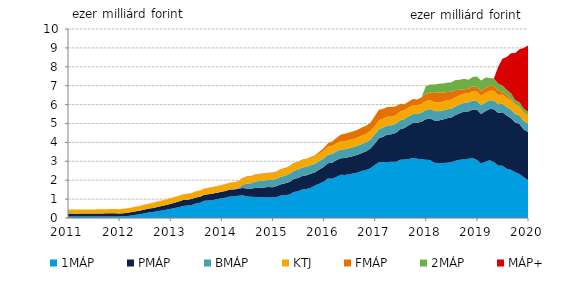
| Category | 1MÁP | PMÁP | BMÁP | KTJ | FMÁP | 2MÁP | MÁP+ |
|---|---|---|---|---|---|---|---|
| 1/31/11 | 0.085 | 0.141 | 0 | 0.218 | 0 | 0 | 0 |
| 2/28/11 | 0.085 | 0.147 | 0 | 0.218 | 0 | 0 | 0 |
| 3/31/11 | 0.081 | 0.149 | 0 | 0.217 | 0 | 0 | 0 |
| 4/30/11 | 0.082 | 0.156 | 0 | 0.216 | 0 | 0 | 0 |
| 5/31/11 | 0.083 | 0.158 | 0 | 0.215 | 0 | 0 | 0 |
| 6/30/11 | 0.083 | 0.159 | 0 | 0.214 | 0 | 0 | 0 |
| 7/31/11 | 0.082 | 0.16 | 0 | 0.214 | 0 | 0 | 0 |
| 8/31/11 | 0.081 | 0.161 | 0 | 0.215 | 0 | 0 | 0 |
| 9/30/11 | 0.08 | 0.164 | 0 | 0.217 | 0 | 0 | 0 |
| 10/31/11 | 0.079 | 0.166 | 0 | 0.219 | 0 | 0 | 0 |
| 11/30/11 | 0.08 | 0.166 | 0 | 0.223 | 0 | 0 | 0 |
| 12/31/11 | 0.08 | 0.166 | 0 | 0.226 | 0 | 0 | 0 |
| 1/31/12 | 0.081 | 0.155 | 0 | 0.225 | 0 | 0 | 0 |
| 2/29/12 | 0.089 | 0.168 | 0 | 0.23 | 0 | 0 | 0 |
| 3/31/12 | 0.106 | 0.176 | 0 | 0.236 | 0 | 0 | 0 |
| 4/30/12 | 0.131 | 0.182 | 0 | 0.24 | 0 | 0 | 0 |
| 5/31/12 | 0.17 | 0.186 | 0 | 0.245 | 0.003 | 0 | 0 |
| 6/30/12 | 0.198 | 0.194 | 0 | 0.25 | 0.004 | 0 | 0 |
| 7/31/12 | 0.254 | 0.2 | 0 | 0.257 | 0.006 | 0 | 0 |
| 8/31/12 | 0.294 | 0.206 | 0 | 0.263 | 0.008 | 0 | 0 |
| 9/30/12 | 0.32 | 0.211 | 0 | 0.268 | 0.008 | 0 | 0 |
| 10/31/12 | 0.358 | 0.227 | 0 | 0.273 | 0.01 | 0 | 0 |
| 11/30/12 | 0.395 | 0.242 | 0 | 0.279 | 0.009 | 0 | 0 |
| 12/31/12 | 0.434 | 0.256 | 0 | 0.284 | 0.01 | 0 | 0 |
| 1/31/13 | 0.482 | 0.26 | 0 | 0.289 | 0.011 | 0 | 0 |
| 2/28/13 | 0.528 | 0.279 | 0 | 0.291 | 0.012 | 0 | 0 |
| 3/31/13 | 0.57 | 0.3 | 0 | 0.294 | 0.013 | 0 | 0 |
| 4/30/13 | 0.636 | 0.31 | 0 | 0.297 | 0.014 | 0 | 0 |
| 5/31/13 | 0.655 | 0.314 | 0 | 0.3 | 0.014 | 0 | 0 |
| 6/30/13 | 0.687 | 0.317 | 0 | 0.302 | 0.014 | 0 | 0 |
| 7/31/13 | 0.766 | 0.324 | 0 | 0.306 | 0.015 | 0 | 0 |
| 8/31/13 | 0.813 | 0.317 | 0 | 0.313 | 0.016 | 0 | 0 |
| 9/30/13 | 0.907 | 0.324 | 0 | 0.317 | 0.019 | 0 | 0 |
| 10/31/13 | 0.927 | 0.33 | 0 | 0.321 | 0.019 | 0 | 0 |
| 11/30/13 | 0.955 | 0.336 | 0 | 0.328 | 0.021 | 0 | 0 |
| 12/31/13 | 0.988 | 0.343 | 0 | 0.335 | 0.021 | 0 | 0 |
| 1/31/14 | 1.039 | 0.354 | 0 | 0.337 | 0.022 | 0 | 0 |
| 2/28/14 | 1.073 | 0.359 | 0 | 0.34 | 0.023 | 0 | 0 |
| 3/31/14 | 1.143 | 0.363 | 0.008 | 0.345 | 0.025 | 0 | 0 |
| 4/30/14 | 1.14 | 0.364 | 0.02 | 0.346 | 0.026 | 0 | 0 |
| 5/31/14 | 1.182 | 0.367 | 0.041 | 0.347 | 0.027 | 0 | 0 |
| 6/30/14 | 1.206 | 0.379 | 0.165 | 0.347 | 0.028 | 0 | 0 |
| 7/31/14 | 1.142 | 0.419 | 0.27 | 0.347 | 0.027 | 0 | 0 |
| 8/31/14 | 1.119 | 0.446 | 0.275 | 0.348 | 0.027 | 0 | 0 |
| 9/30/14 | 1.116 | 0.475 | 0.347 | 0.349 | 0.029 | 0 | 0 |
| 10/31/14 | 1.101 | 0.499 | 0.365 | 0.352 | 0.029 | 0 | 0 |
| 11/30/14 | 1.096 | 0.524 | 0.368 | 0.353 | 0.029 | 0 | 0 |
| 12/31/14 | 1.089 | 0.556 | 0.372 | 0.355 | 0.029 | 0 | 0 |
| 1/31/15 | 1.084 | 0.545 | 0.387 | 0.358 | 0.033 | 0 | 0 |
| 2/28/15 | 1.105 | 0.589 | 0.391 | 0.359 | 0.034 | 0 | 0 |
| 3/31/15 | 1.189 | 0.603 | 0.394 | 0.368 | 0.035 | 0 | 0 |
| 4/30/15 | 1.204 | 0.635 | 0.397 | 0.37 | 0.034 | 0 | 0 |
| 5/31/15 | 1.246 | 0.665 | 0.435 | 0.372 | 0.034 | 0 | 0 |
| 6/30/15 | 1.371 | 0.686 | 0.444 | 0.376 | 0.035 | 0 | 0 |
| 7/31/15 | 1.41 | 0.706 | 0.446 | 0.382 | 0.033 | 0 | 0 |
| 8/31/15 | 1.503 | 0.718 | 0.447 | 0.387 | 0.036 | 0 | 0 |
| 9/30/15 | 1.537 | 0.728 | 0.448 | 0.389 | 0.035 | 0 | 0 |
| 10/31/15 | 1.601 | 0.739 | 0.449 | 0.394 | 0.037 | 0 | 0 |
| 11/30/15 | 1.719 | 0.701 | 0.451 | 0.398 | 0.052 | 0 | 0 |
| 12/31/15 | 1.816 | 0.744 | 0.454 | 0.403 | 0.081 | 0 | 0 |
| 1/31/16 | 1.914 | 0.782 | 0.455 | 0.409 | 0.127 | 0 | 0 |
| 2/29/16 | 2.088 | 0.809 | 0.456 | 0.415 | 0.18 | 0 | 0 |
| 3/31/16 | 2.076 | 0.852 | 0.46 | 0.415 | 0.243 | 0 | 0 |
| 4/30/16 | 2.17 | 0.885 | 0.461 | 0.419 | 0.293 | 0 | 0 |
| 5/31/16 | 2.287 | 0.874 | 0.465 | 0.423 | 0.353 | 0 | 0 |
| 6/30/16 | 2.281 | 0.892 | 0.467 | 0.426 | 0.388 | 0 | 0 |
| 7/31/16 | 2.315 | 0.907 | 0.47 | 0.43 | 0.395 | 0 | 0 |
| 8/31/16 | 2.355 | 0.924 | 0.472 | 0.433 | 0.407 | 0 | 0 |
| 9/30/16 | 2.407 | 0.941 | 0.475 | 0.437 | 0.406 | 0 | 0 |
| 10/31/16 | 2.484 | 0.959 | 0.476 | 0.439 | 0.424 | 0 | 0 |
| 11/30/16 | 2.541 | 0.985 | 0.477 | 0.444 | 0.429 | 0 | 0 |
| 12/31/16 | 2.637 | 1.043 | 0.478 | 0.454 | 0.429 | 0 | 0 |
| 1/31/17 | 2.806 | 1.125 | 0.479 | 0.46 | 0.516 | 0 | 0 |
| 2/28/17 | 2.947 | 1.268 | 0.48 | 0.46 | 0.568 | 0 | 0 |
| 3/31/17 | 2.967 | 1.337 | 0.481 | 0.46 | 0.535 | 0 | 0 |
| 4/30/17 | 2.961 | 1.462 | 0.481 | 0.459 | 0.508 | 0 | 0 |
| 5/31/17 | 2.974 | 1.454 | 0.481 | 0.456 | 0.503 | 0 | 0 |
| 6/30/17 | 2.977 | 1.528 | 0.481 | 0.456 | 0.475 | 0 | 0 |
| 7/31/17 | 3.088 | 1.608 | 0.48 | 0.457 | 0.409 | 0 | 0 |
| 8/31/17 | 3.097 | 1.661 | 0.48 | 0.457 | 0.327 | 0 | 0 |
| 9/30/17 | 3.123 | 1.782 | 0.48 | 0.459 | 0.319 | 0 | 0 |
| 10/31/17 | 3.171 | 1.858 | 0.48 | 0.462 | 0.325 | 0 | 0 |
| 11/30/17 | 3.136 | 1.904 | 0.481 | 0.463 | 0.291 | 0 | 0 |
| 12/31/17 | 3.11 | 1.976 | 0.481 | 0.469 | 0.352 | 0 | 0 |
| 1/31/18 | 3.078 | 2.141 | 0.502 | 0.471 | 0.365 | 0.412 | 0 |
| 2/28/18 | 3.071 | 2.197 | 0.501 | 0.471 | 0.393 | 0.436 | 0 |
| 3/31/18 | 2.925 | 2.233 | 0.501 | 0.472 | 0.488 | 0.446 | 0 |
| 4/30/18 | 2.913 | 2.251 | 0.478 | 0.473 | 0.528 | 0.46 | 0 |
| 5/31/18 | 2.904 | 2.303 | 0.479 | 0.472 | 0.488 | 0.475 | 0 |
| 6/30/18 | 2.927 | 2.355 | 0.479 | 0.474 | 0.439 | 0.485 | 0 |
| 7/31/18 | 2.964 | 2.354 | 0.465 | 0.476 | 0.424 | 0.503 | 0 |
| 8/31/18 | 3.03 | 2.416 | 0.465 | 0.482 | 0.378 | 0.526 | 0 |
| 9/30/18 | 3.078 | 2.468 | 0.465 | 0.485 | 0.286 | 0.538 | 0 |
| 10/31/18 | 3.109 | 2.525 | 0.465 | 0.488 | 0.228 | 0.554 | 0 |
| 11/30/18 | 3.141 | 2.5 | 0.465 | 0.493 | 0.237 | 0.484 | 0 |
| 12/31/18 | 3.17 | 2.576 | 0.465 | 0.496 | 0.254 | 0.5 | 0 |
| 1/31/19 | 3.075 | 2.654 | 0.465 | 0.5 | 0.257 | 0.536 | 0 |
| 2/28/19 | 2.887 | 2.61 | 0.464 | 0.502 | 0.25 | 0.557 | 0 |
| 3/31/19 | 2.979 | 2.668 | 0.464 | 0.504 | 0.255 | 0.565 | 0 |
| 4/30/19 | 3.051 | 2.718 | 0.464 | 0.506 | 0.276 | 0.392 | 0 |
| 5/31/19 | 2.966 | 2.79 | 0.464 | 0.507 | 0.263 | 0.398 | 0 |
| 6/30/19 | 2.774 | 2.778 | 0.461 | 0.498 | 0.213 | 0.394 | 0.883 |
| 7/31/19 | 2.759 | 2.831 | 0.46 | 0.49 | 0.167 | 0.303 | 1.417 |
| 8/31/19 | 2.61 | 2.81 | 0.459 | 0.486 | 0.131 | 0.293 | 1.725 |
| 9/30/19 | 2.551 | 2.733 | 0.458 | 0.489 | 0.088 | 0.279 | 2.124 |
| 10/31/19 | 2.418 | 2.631 | 0.453 | 0.487 | 0.03 | 0.228 | 2.485 |
| 11/30/19 | 2.322 | 2.648 | 0.452 | 0.473 | 0 | 0.225 | 2.815 |
| 12/31/19 | 2.158 | 2.518 | 0.451 | 0.455 | 0 | 0.215 | 3.196 |
| 1/31/20 | 2.009 | 2.542 | 0.451 | 0.439 | 0 | 0.183 | 3.504 |